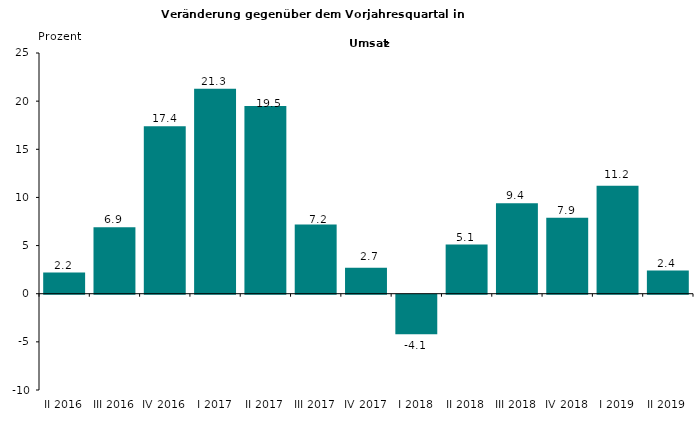
| Category | 2,2 6,9 17,4 21,3 19,5 7,2 2,7 -4,1 5,1 9,4 7,9 11,2 2,4 |
|---|---|
| II 2016 | 2.2 |
| III 2016 | 6.9 |
| IV 2016 | 17.4 |
| I 2017 | 21.3 |
| II 2017 | 19.5 |
| III 2017 | 7.2 |
| IV 2017 | 2.7 |
| I 2018 | -4.1 |
| II 2018 | 5.1 |
| III 2018 | 9.4 |
| IV 2018 | 7.9 |
| I 2019 | 11.2 |
| II 2019 | 2.4 |